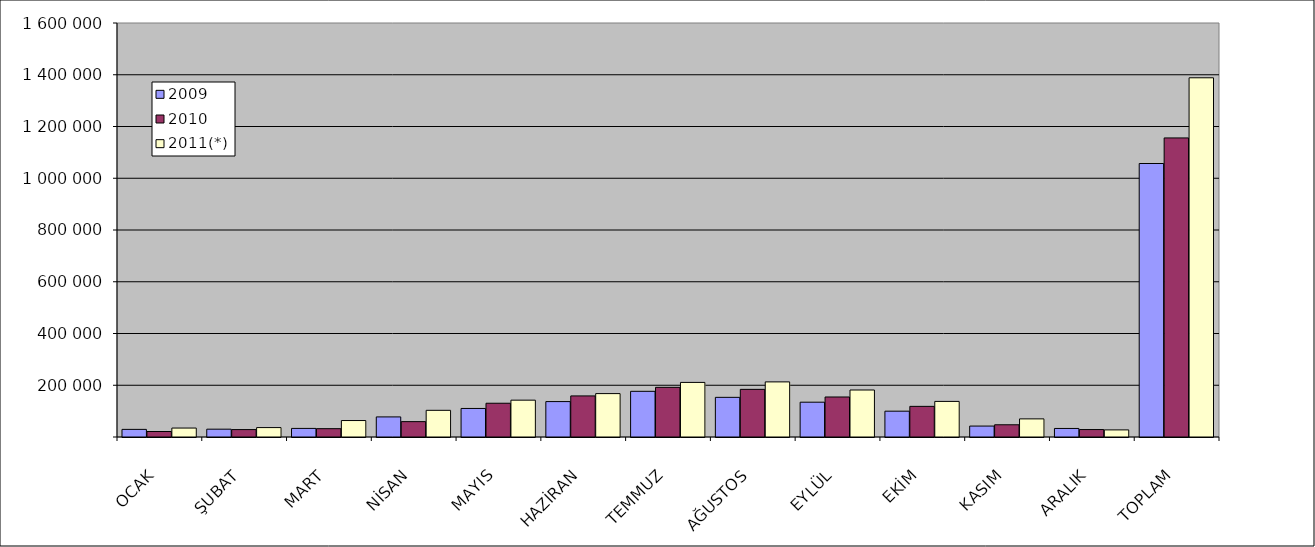
| Category | 2009 | 2010 | 2011(*) |
|---|---|---|---|
| OCAK | 29457 | 21245 | 34545 |
| ŞUBAT | 30211 | 28658 | 36409 |
| MART | 33192 | 32220 | 63629 |
| NİSAN | 77650 | 59385 | 103097 |
| MAYIS | 110304 | 130455 | 142388 |
| HAZİRAN | 136875 | 158784 | 167719 |
| TEMMUZ | 176531 | 191920 | 210943 |
| AĞUSTOS | 153225 | 184109 | 212975 |
| EYLÜL | 134514 | 154633 | 181590 |
| EKİM | 99764 | 118402 | 137538 |
| KASIM | 42217 | 47260 | 69997 |
| ARALIK | 33008 | 28749 | 27441 |
| TOPLAM | 1056948 | 1155820 | 1388271 |